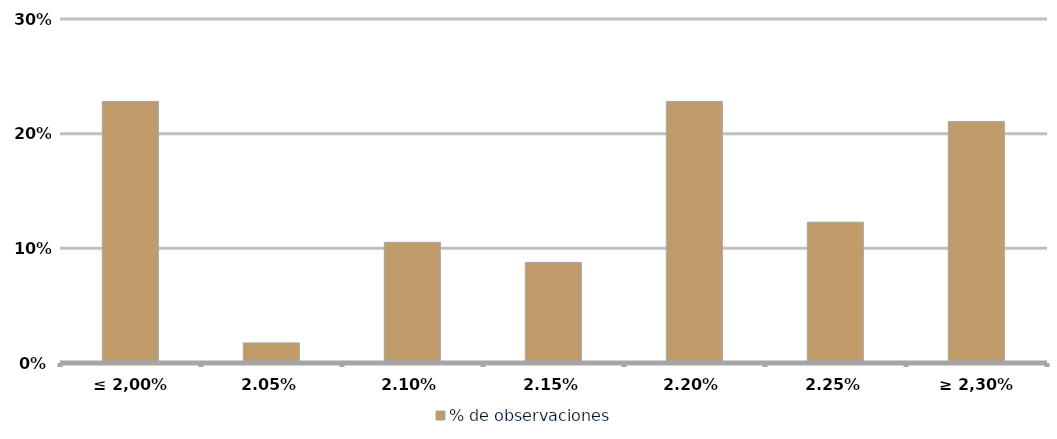
| Category | % de observaciones  |
|---|---|
| ≤ 2,00% | 0.228 |
| 2,05% | 0.018 |
| 2,10% | 0.105 |
| 2,15% | 0.088 |
| 2,20% | 0.228 |
| 2,25% | 0.123 |
| ≥ 2,30% | 0.211 |